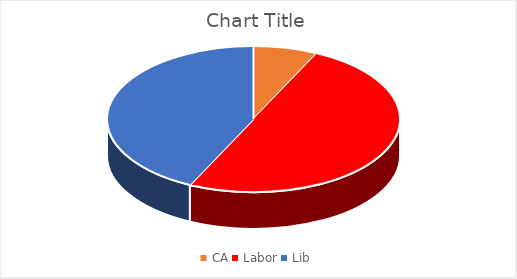
| Category | Series 0 |
|---|---|
| CA | 1 |
| Labor | 7 |
| Lib | 6 |